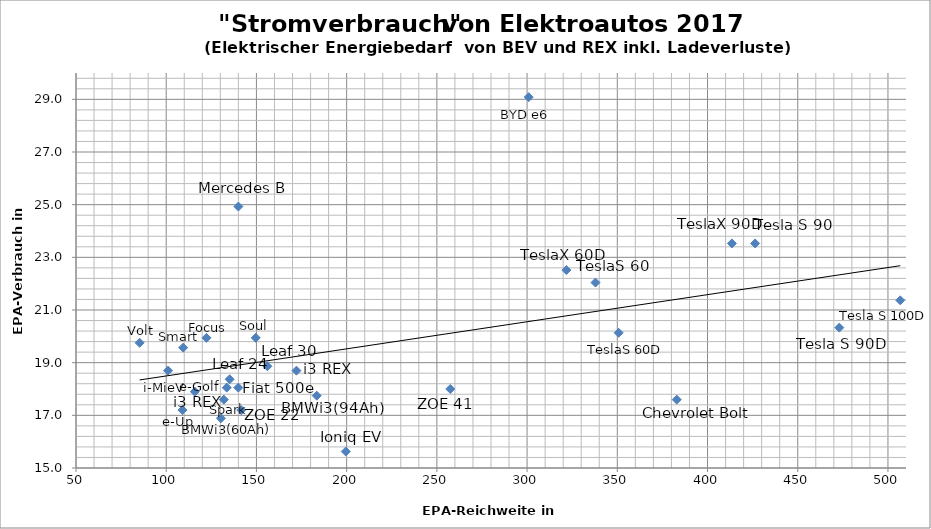
| Category | EPA |
|---|---|
| 130.329 | 16.887 |
| 382.942 | 17.597 |
| 131.938 | 17.597 |
| 183.426 | 17.746 |
| 133.547 | 18.052 |
| 139.983 | 18.052 |
| 135.156 | 18.368 |
| 101.0 | 18.696 |
| 172.163 | 18.696 |
| 109.412 | 19.57 |
| 149.637 | 19.943 |
| 122.28399999999999 | 19.943 |
| 350.762 | 20.135 |
| 473.046 | 20.33 |
| 337.89 | 22.042 |
| 321.8 | 22.516 |
| 426.385 | 23.528 |
| 413.513 | 23.528 |
| 139.983 | 24.929 |
| 300.883 | 29.083 |
| 141.59199999999998 | 17.2 |
| 257.44 | 18 |
| 109.0 | 17.2 |
| 199.516 | 15.627 |
| 506.835 | 21.367 |
| 115.848 | 17.897 |
| 156.073 | 18.865 |
| 85.277 | 19.755 |